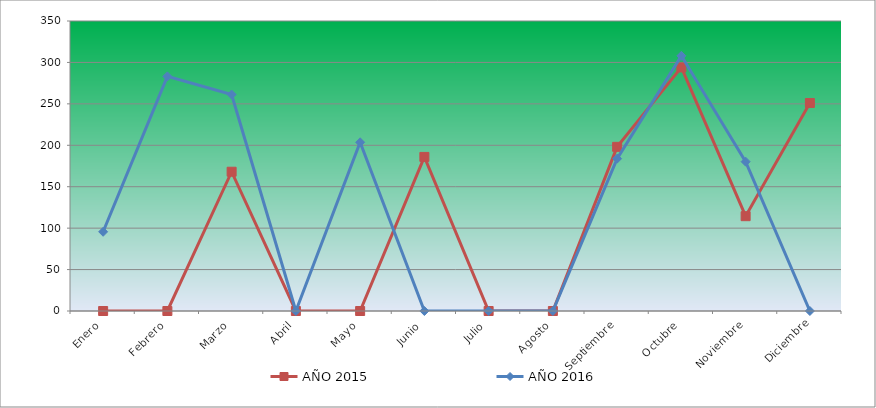
| Category | AÑO 2015 | AÑO 2016 |
|---|---|---|
| Enero | 0 | 95.594 |
| Febrero | 0 | 283.134 |
| Marzo | 168.09 | 261.242 |
| Abril | 0 | 0 |
| Mayo | 0 | 203.593 |
| Junio | 185.972 | 0 |
| Julio | 0 | 0 |
| Agosto | 0 | 0 |
| Septiembre | 198.132 | 183.891 |
| Octubre | 293.979 | 307.944 |
| Noviembre | 114.444 | 180.242 |
| Diciembre | 251.062 | 0 |